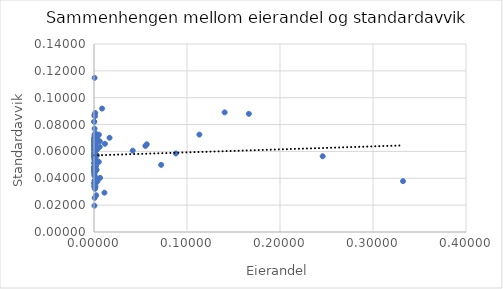
| Category | Series 0 |
|---|---|
| 0.000231152986817092 | 0.061 |
| 0.0012 | 0.032 |
| 0.0008 | 0.07 |
| 0.000219452106550727 | 0.082 |
| 0.0015813784762450012 | 0.053 |
| 0.0 | 0.064 |
| 0.005172048625014135 | 0.052 |
| 0.0008861980235444139 | 0.068 |
| 0.1665303857666496 | 0.088 |
| 0.0004 | 0.047 |
| 0.0013 | 0.089 |
| 0.0010223319461726752 | 0.049 |
| 0.0008191903449479407 | 0.071 |
| 0.00013728016980114066 | 0.065 |
| 0.0112 | 0.029 |
| 0.00020851698518656965 | 0.082 |
| 0.0018278201209073978 | 0.057 |
| 0.0006695918020169416 | 0.071 |
| 0.33227900073781924 | 0.038 |
| 0.0001265607998158437 | 0.068 |
| 0.0005 | 0.02 |
| 0.0006018495806229883 | 0.077 |
| 0.0018794269012865049 | 0.047 |
| 0.011774773002243258 | 0.066 |
| 0.00628696670859278 | 0.067 |
| 0.0001980452650267387 | 0.07 |
| 0.0007799970978285392 | 0.057 |
| 0.00016414944962567013 | 0.062 |
| 0.0021391691434422756 | 0.07 |
| 0.0011680213442347104 | 0.058 |
| 0.0004842428578682265 | 0.038 |
| 0.0011154443757192289 | 0.065 |
| 0.002806774055238904 | 0.046 |
| 0.0031 | 0.057 |
| 0.0016 | 0.034 |
| 0.0007 | 0.025 |
| 0.0037123537913334543 | 0.038 |
| 0.0006672693960784447 | 0.048 |
| 0.0007149598565675485 | 0.054 |
| 0.14047338571960066 | 0.089 |
| 0.0087 | 0.092 |
| 0.07220604932238771 | 0.05 |
| 0.24588935695115402 | 0.056 |
| 0.003467043595915613 | 0.062 |
| 0.0018903057531208395 | 0.071 |
| 0.0035785120476896914 | 0.071 |
| 0.000699357659883844 | 0.066 |
| 0.0061503534018977875 | 0.063 |
| 0.005258083669203507 | 0.072 |
| 0.0014317608837763843 | 0.074 |
| 0.0006774924185142361 | 0.051 |
| 0.00410818701756315 | 0.053 |
| 0.0024 | 0.027 |
| 0.0002595313500263658 | 0.046 |
| 0.0002150097562035386 | 0.067 |
| 0.00012615069855855925 | 0.044 |
| 0.0018477978961699518 | 0.067 |
| 0.0013458433491862706 | 0.039 |
| 0.00046785156207055235 | 0.054 |
| 0.0005476785940811693 | 0.06 |
| 0.0013356570894122175 | 0.055 |
| 0.00042150122363745525 | 0.042 |
| 0.00025064852215895194 | 0.047 |
| 0.0022303495682828777 | 0.052 |
| 0.0009988300305536235 | 0.054 |
| 0.00165893698442908 | 0.066 |
| 0.0005247466455924037 | 0.052 |
| 0.00040691446519699115 | 0.058 |
| 0.0003990322715591934 | 0.056 |
| 0.0004880685234893642 | 0.067 |
| 0.00015238989812994718 | 0.064 |
| 0.00041008365977458837 | 0.087 |
| 0.0027 | 0.039 |
| 0.055245692699294024 | 0.064 |
| 0.0011458478338760992 | 0.057 |
| 0.0010843163189620288 | 0.038 |
| 0.0001523884416425563 | 0.051 |
| 0.0002259066787112356 | 0.058 |
| 0.0004942704226655578 | 0.061 |
| 0.0006428551134384107 | 0.115 |
| 0.0009999908251586977 | 0.068 |
| 0.016696945936160466 | 0.07 |
| 0.0005084635570901136 | 0.055 |
| 0.00072015186675707 | 0.042 |
| 0.08801167522340708 | 0.058 |
| 0.00027844682435660583 | 0.056 |
| 0.00025298676391990115 | 0.058 |
| 0.000840726804417122 | 0.032 |
| 0.0011553190869533444 | 0.06 |
| 0.0022431693858321992 | 0.049 |
| 0.0008390870070072087 | 0.065 |
| 0.0004443807727332833 | 0.048 |
| 0.0009427044041259418 | 0.046 |
| 0.0010006183918867902 | 0.086 |
| 0.0003374569664220461 | 0.049 |
| 0.00016642098091662047 | 0.047 |
| 0.11331668565997388 | 0.073 |
| 0.00020837098023288898 | 0.056 |
| 0.00034641073943863295 | 0.057 |
| 0.00011097748891312593 | 0.048 |
| 0.0002243079874956221 | 0.045 |
| 0.006512622934518222 | 0.04 |
| 0.001186020139019977 | 0.033 |
| 0.0005152007740349949 | 0.072 |
| 0.00016696260084055116 | 0.034 |
| 3.027877476889338e-05 | 0.036 |
| 0.05675197311235473 | 0.065 |
| 0.00041008365977458837 | 0.069 |
| 0.001434 | 0.036 |
| 0.0003609831443199048 | 0.062 |
| 0.0003489786288085406 | 0.068 |
| 0.041641115984213266 | 0.061 |
| 0.0008499078682596311 | 0.044 |